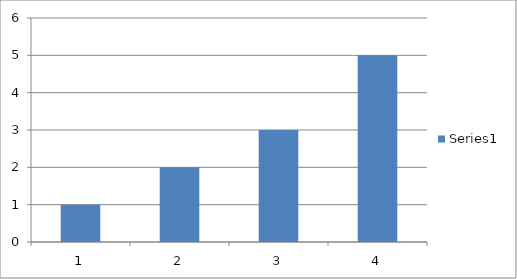
| Category | Series 0 |
|---|---|
| 0 | 1 |
| 1 | 2 |
| 2 | 3 |
| 3 | 5 |